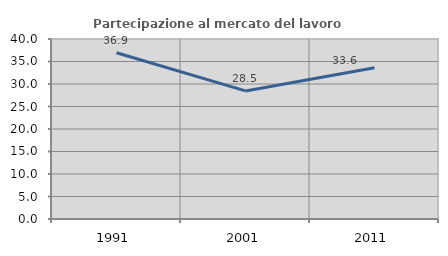
| Category | Partecipazione al mercato del lavoro  femminile |
|---|---|
| 1991.0 | 36.949 |
| 2001.0 | 28.464 |
| 2011.0 | 33.589 |